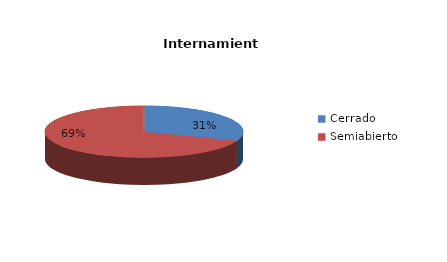
| Category | Series 0 |
|---|---|
| Cerrado | 12 |
| Semiabierto | 27 |
| Abierto | 0 |
| Terapeúticos | 0 |